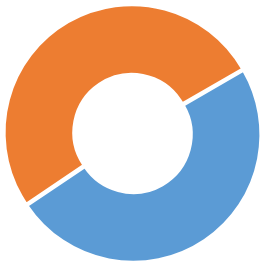
| Category | Series 0 |
|---|---|
| 0 | 0.489 |
| 1 | 0.511 |
| 2 | 0 |
| 3 | 0 |
| 4 | 0 |
| 5 | 0 |
| 6 | 0 |
| 7 | 0 |
| 8 | 0 |
| 9 | 0 |